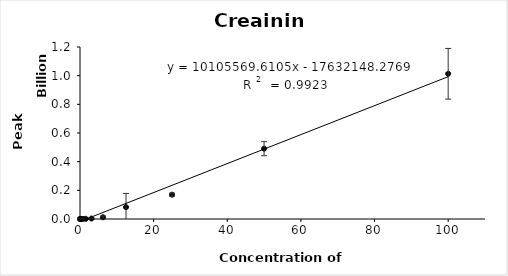
| Category | Series 0 |
|---|---|
| 0.012 | 88336.333 |
| 0.024 | 28458.667 |
| 0.049 | 25733.333 |
| 0.098 | 45332.333 |
| 0.195 | 164745 |
| 0.39 | 131261 |
| 0.78 | 602671.333 |
| 1.56 | 1231114.333 |
| 3.12 | 3167002 |
| 6.24 | 12240420.333 |
| 12.5 | 82858580 |
| 25.0 | 169522466.667 |
| 50.0 | 490651818.667 |
| 100.0 | 1013182528 |